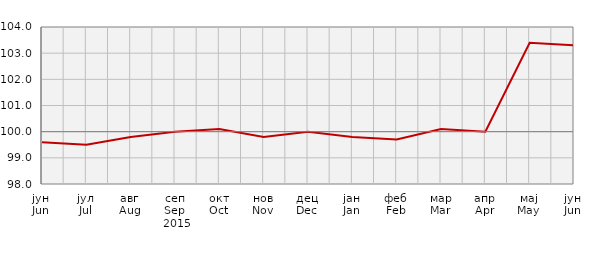
| Category | Индекси цијена произвођача
Producer price indices |
|---|---|
| јун
Jun | 99.6 |
| јул
Jul | 99.5 |
| авг
Aug | 99.8 |
| сеп
Sep | 100 |
| окт
Oct | 100.1 |
| нов
Nov | 99.8 |
| дец
Dec | 100 |
| јан
Jan | 99.8 |
| феб
Feb | 99.7 |
| мар
Mar | 100.1 |
| апр
Apr | 100 |
| мај
May | 103.4 |
| јун
Jun | 103.3 |